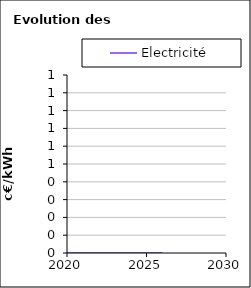
| Category | Electricité |
|---|---|
| 2020.0 | 0 |
| 2021.0 | 0 |
| 2022.0 | 0 |
| 2023.0 | 0 |
| 2024.0 | 0 |
| 2025.0 | 0 |
| 2026.0 | 0 |